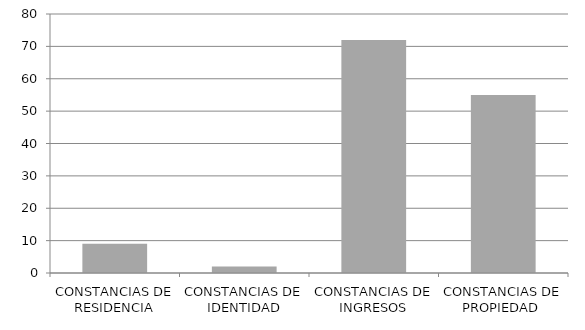
| Category | Series 0 |
|---|---|
| CONSTANCIAS DE RESIDENCIA | 9 |
| CONSTANCIAS DE IDENTIDAD | 2 |
| CONSTANCIAS DE INGRESOS | 72 |
| CONSTANCIAS DE PROPIEDAD  | 55 |